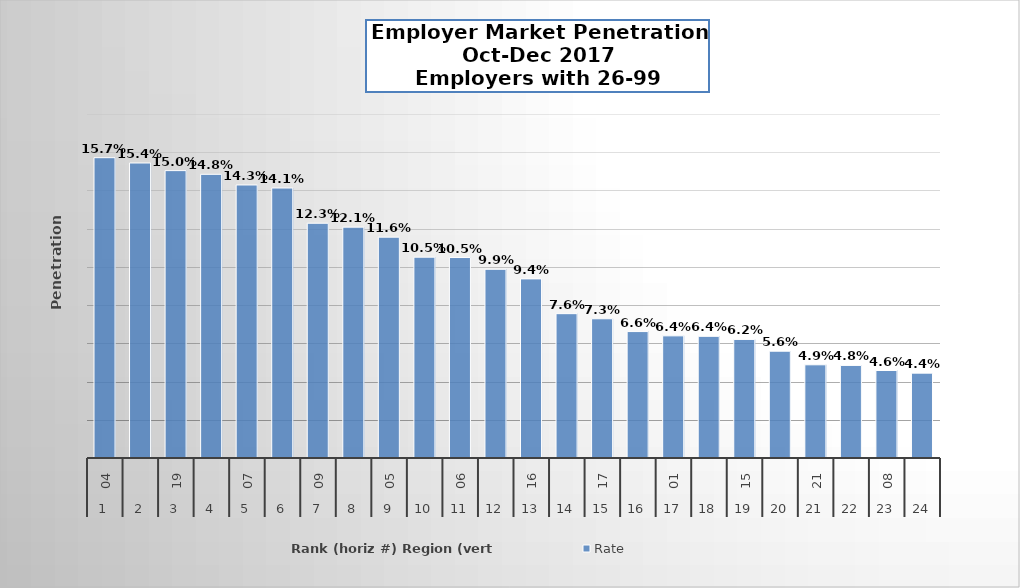
| Category | Rate |
|---|---|
| 0 | 0.157 |
| 1 | 0.154 |
| 2 | 0.15 |
| 3 | 0.148 |
| 4 | 0.143 |
| 5 | 0.141 |
| 6 | 0.123 |
| 7 | 0.121 |
| 8 | 0.116 |
| 9 | 0.105 |
| 10 | 0.105 |
| 11 | 0.099 |
| 12 | 0.094 |
| 13 | 0.076 |
| 14 | 0.073 |
| 15 | 0.066 |
| 16 | 0.064 |
| 17 | 0.064 |
| 18 | 0.062 |
| 19 | 0.056 |
| 20 | 0.049 |
| 21 | 0.048 |
| 22 | 0.046 |
| 23 | 0.044 |